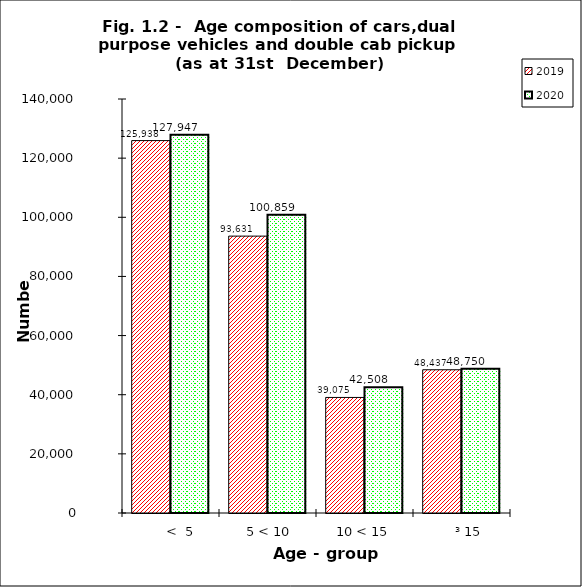
| Category | 2019 | 2020 |
|---|---|---|
|       <  5 | 125938 | 127947 |
|   5 < 10 | 93631 | 100859 |
| 10 < 15 | 39075 | 42508 |
|      ³ 15 | 48437 | 48750 |